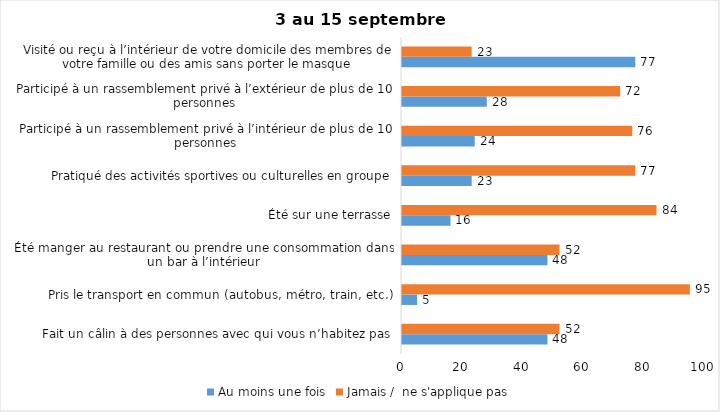
| Category | Au moins une fois | Jamais /  ne s'applique pas |
|---|---|---|
| Fait un câlin à des personnes avec qui vous n’habitez pas | 48 | 52 |
| Pris le transport en commun (autobus, métro, train, etc.) | 5 | 95 |
| Été manger au restaurant ou prendre une consommation dans un bar à l’intérieur | 48 | 52 |
| Été sur une terrasse | 16 | 84 |
| Pratiqué des activités sportives ou culturelles en groupe | 23 | 77 |
| Participé à un rassemblement privé à l’intérieur de plus de 10 personnes | 24 | 76 |
| Participé à un rassemblement privé à l’extérieur de plus de 10 personnes | 28 | 72 |
| Visité ou reçu à l’intérieur de votre domicile des membres de votre famille ou des amis sans porter le masque | 77 | 23 |